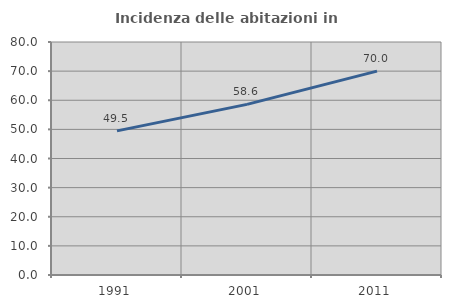
| Category | Incidenza delle abitazioni in proprietà  |
|---|---|
| 1991.0 | 49.485 |
| 2001.0 | 58.586 |
| 2011.0 | 70 |